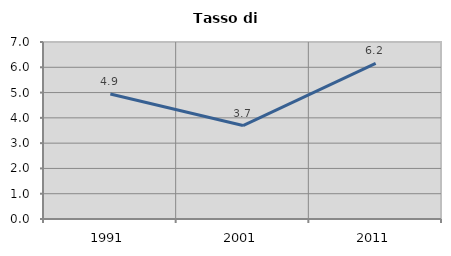
| Category | Tasso di disoccupazione   |
|---|---|
| 1991.0 | 4.945 |
| 2001.0 | 3.695 |
| 2011.0 | 6.155 |